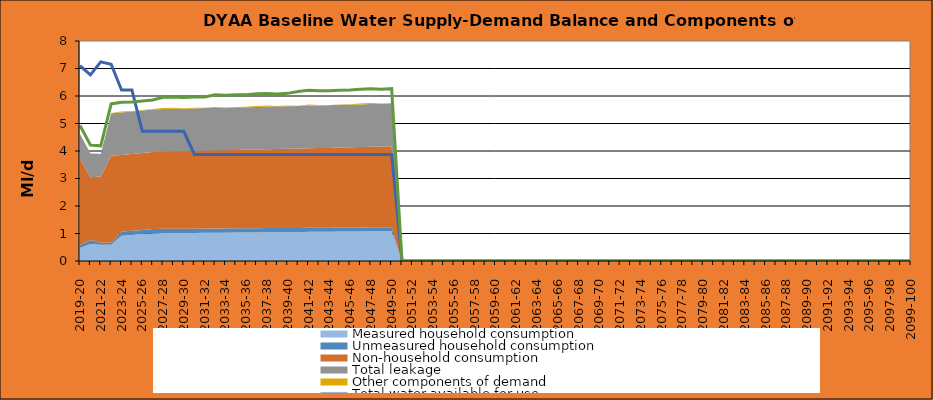
| Category | Total water available for use | Total demand + target headroom (baseline) |
|---|---|---|
| 0 | 7.1 | 4.93 |
| 1 | 6.77 | 4.22 |
| 2 | 7.24 | 4.188 |
| 3 | 7.154 | 5.712 |
| 4 | 6.214 | 5.77 |
| 5 | 6.214 | 5.781 |
| 6 | 4.714 | 5.817 |
| 7 | 4.714 | 5.853 |
| 8 | 4.714 | 5.954 |
| 9 | 4.714 | 5.96 |
| 10 | 4.714 | 5.941 |
| 11 | 3.874 | 5.962 |
| 12 | 3.874 | 5.963 |
| 13 | 3.874 | 6.044 |
| 14 | 3.874 | 6.025 |
| 15 | 3.874 | 6.041 |
| 16 | 3.874 | 6.047 |
| 17 | 3.874 | 6.078 |
| 18 | 3.874 | 6.094 |
| 19 | 3.874 | 6.075 |
| 20 | 3.874 | 6.096 |
| 21 | 3.874 | 6.167 |
| 22 | 3.874 | 6.208 |
| 23 | 3.874 | 6.189 |
| 24 | 3.874 | 6.195 |
| 25 | 3.874 | 6.211 |
| 26 | 3.874 | 6.217 |
| 27 | 3.874 | 6.248 |
| 28 | 3.874 | 6.264 |
| 29 | 3.874 | 6.245 |
| 30 | 3.874 | 6.266 |
| 31 | 0 | 0 |
| 32 | 0 | 0 |
| 33 | 0 | 0 |
| 34 | 0 | 0 |
| 35 | 0 | 0 |
| 36 | 0 | 0 |
| 37 | 0 | 0 |
| 38 | 0 | 0 |
| 39 | 0 | 0 |
| 40 | 0 | 0 |
| 41 | 0 | 0 |
| 42 | 0 | 0 |
| 43 | 0 | 0 |
| 44 | 0 | 0 |
| 45 | 0 | 0 |
| 46 | 0 | 0 |
| 47 | 0 | 0 |
| 48 | 0 | 0 |
| 49 | 0 | 0 |
| 50 | 0 | 0 |
| 51 | 0 | 0 |
| 52 | 0 | 0 |
| 53 | 0 | 0 |
| 54 | 0 | 0 |
| 55 | 0 | 0 |
| 56 | 0 | 0 |
| 57 | 0 | 0 |
| 58 | 0 | 0 |
| 59 | 0 | 0 |
| 60 | 0 | 0 |
| 61 | 0 | 0 |
| 62 | 0 | 0 |
| 63 | 0 | 0 |
| 64 | 0 | 0 |
| 65 | 0 | 0 |
| 66 | 0 | 0 |
| 67 | 0 | 0 |
| 68 | 0 | 0 |
| 69 | 0 | 0 |
| 70 | 0 | 0 |
| 71 | 0 | 0 |
| 72 | 0 | 0 |
| 73 | 0 | 0 |
| 74 | 0 | 0 |
| 75 | 0 | 0 |
| 76 | 0 | 0 |
| 77 | 0 | 0 |
| 78 | 0 | 0 |
| 79 | 0 | 0 |
| 80 | 0 | 0 |